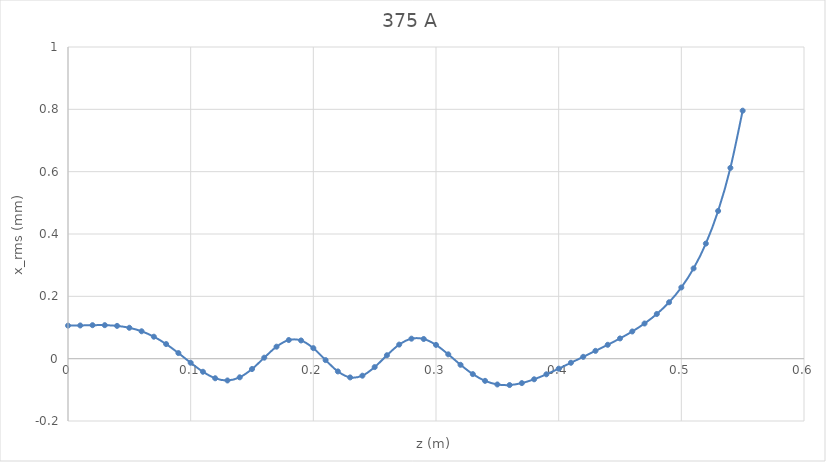
| Category | Series 0 |
|---|---|
| 0.0 | 0.106 |
| 0.01 | 0.107 |
| 0.02 | 0.107 |
| 0.03 | 0.107 |
| 0.04 | 0.105 |
| 0.05 | 0.099 |
| 0.06 | 0.088 |
| 0.07 | 0.07 |
| 0.08 | 0.047 |
| 0.09 | 0.018 |
| 0.1 | -0.013 |
| 0.11 | -0.042 |
| 0.12 | -0.063 |
| 0.13 | -0.07 |
| 0.14 | -0.06 |
| 0.15 | -0.033 |
| 0.16 | 0.003 |
| 0.17 | 0.038 |
| 0.18 | 0.06 |
| 0.19 | 0.058 |
| 0.2 | 0.034 |
| 0.21 | -0.005 |
| 0.22 | -0.041 |
| 0.23 | -0.06 |
| 0.24 | -0.055 |
| 0.25 | -0.027 |
| 0.26 | 0.011 |
| 0.27 | 0.045 |
| 0.28 | 0.064 |
| 0.29 | 0.063 |
| 0.3 | 0.044 |
| 0.31 | 0.014 |
| 0.32 | -0.02 |
| 0.33 | -0.05 |
| 0.34 | -0.071 |
| 0.35 | -0.083 |
| 0.36 | -0.085 |
| 0.37 | -0.078 |
| 0.38 | -0.066 |
| 0.39 | -0.05 |
| 0.4 | -0.032 |
| 0.41 | -0.013 |
| 0.42 | 0.006 |
| 0.43 | 0.025 |
| 0.44 | 0.045 |
| 0.45 | 0.065 |
| 0.46 | 0.087 |
| 0.47 | 0.113 |
| 0.48 | 0.143 |
| 0.49 | 0.181 |
| 0.5 | 0.228 |
| 0.51 | 0.29 |
| 0.52 | 0.369 |
| 0.53 | 0.474 |
| 0.54 | 0.612 |
| 0.55 | 0.796 |